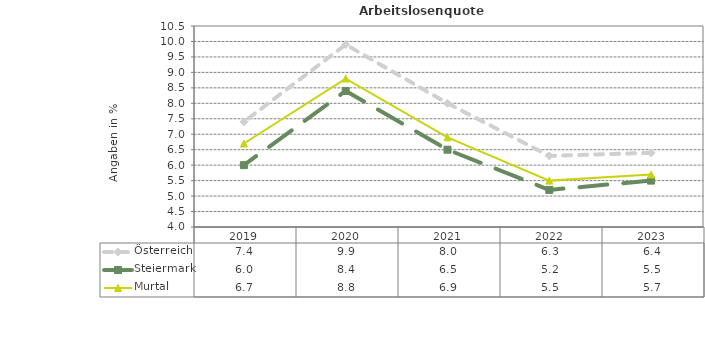
| Category | Österreich | Steiermark | Murtal |
|---|---|---|---|
| 2023.0 | 6.4 | 5.5 | 5.7 |
| 2022.0 | 6.3 | 5.2 | 5.5 |
| 2021.0 | 8 | 6.5 | 6.9 |
| 2020.0 | 9.9 | 8.4 | 8.8 |
| 2019.0 | 7.4 | 6 | 6.7 |